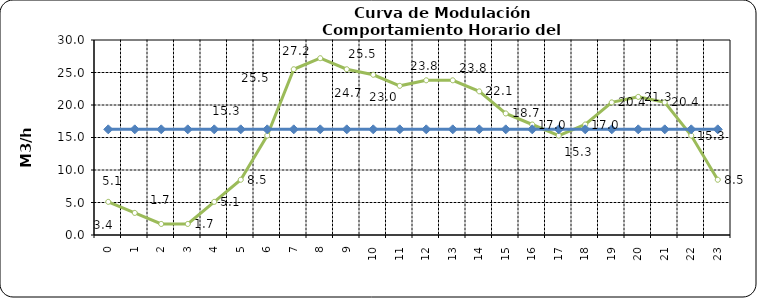
| Category | Series 2 | Series 0 |
|---|---|---|
| 0.0 | 5.1 | 16.256 |
| 1.0 | 3.4 | 16.256 |
| 2.0 | 1.7 | 16.256 |
| 3.0 | 1.7 | 16.256 |
| 4.0 | 5.1 | 16.256 |
| 5.0 | 8.5 | 16.256 |
| 6.0 | 15.3 | 16.256 |
| 7.0 | 25.5 | 16.256 |
| 8.0 | 27.2 | 16.256 |
| 9.0 | 25.5 | 16.256 |
| 10.0 | 24.65 | 16.256 |
| 11.0 | 22.95 | 16.256 |
| 12.0 | 23.8 | 16.256 |
| 13.0 | 23.8 | 16.256 |
| 14.0 | 22.1 | 16.256 |
| 15.0 | 18.7 | 16.256 |
| 16.0 | 17 | 16.256 |
| 17.0 | 15.3 | 16.256 |
| 18.0 | 17 | 16.256 |
| 19.0 | 20.4 | 16.256 |
| 20.0 | 21.25 | 16.256 |
| 21.0 | 20.4 | 16.256 |
| 22.0 | 15.3 | 16.256 |
| 23.0 | 8.5 | 16.256 |